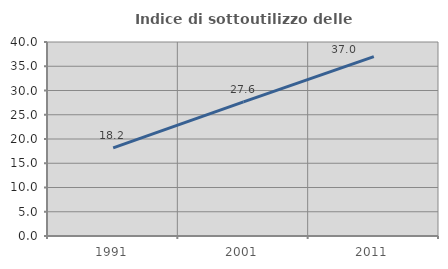
| Category | Indice di sottoutilizzo delle abitazioni  |
|---|---|
| 1991.0 | 18.16 |
| 2001.0 | 27.646 |
| 2011.0 | 36.998 |